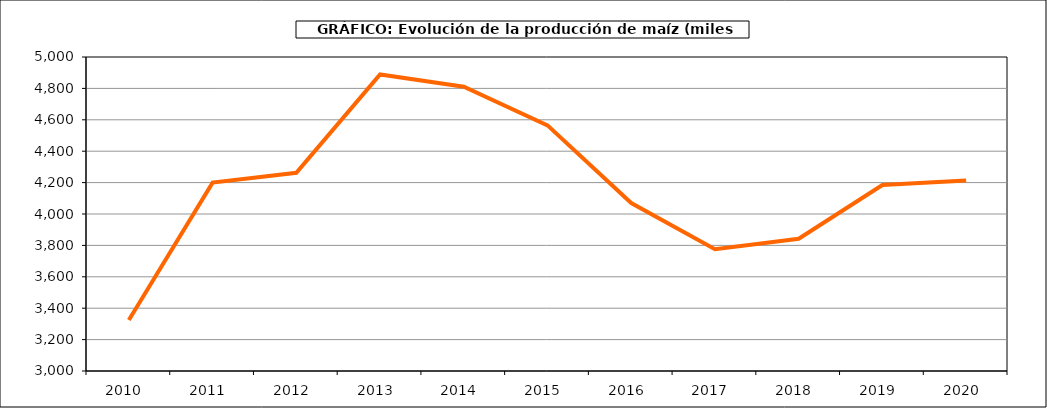
| Category | Superficie |
|---|---|
| 2010.0 | 3324.821 |
| 2011.0 | 4199.927 |
| 2012.0 | 4262.116 |
| 2013.0 | 4888.462 |
| 2014.0 | 4810.645 |
| 2015.0 | 4564.416 |
| 2016.0 | 4069.508 |
| 2017.0 | 3775.645 |
| 2018.0 | 3842.519 |
| 2019.0 | 4184.459 |
| 2020.0 | 4214.102 |